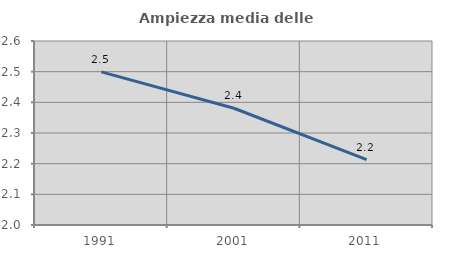
| Category | Ampiezza media delle famiglie |
|---|---|
| 1991.0 | 2.499 |
| 2001.0 | 2.381 |
| 2011.0 | 2.213 |